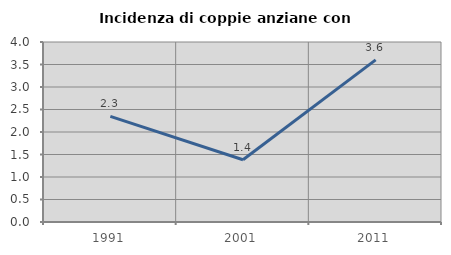
| Category | Incidenza di coppie anziane con figli |
|---|---|
| 1991.0 | 2.347 |
| 2001.0 | 1.382 |
| 2011.0 | 3.604 |